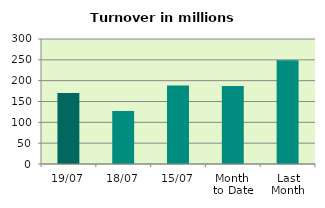
| Category | Series 0 |
|---|---|
| 19/07 | 170.617 |
| 18/07 | 127.149 |
| 15/07 | 188.522 |
| Month 
to Date | 186.97 |
| Last
Month | 248.976 |